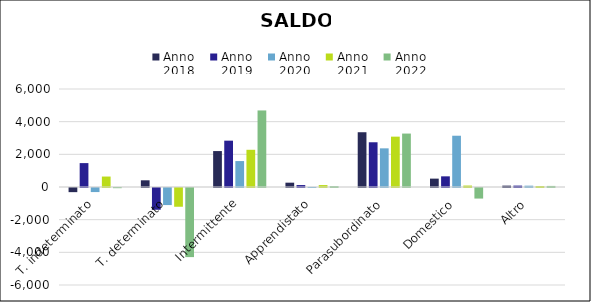
| Category | Anno
2018 | Anno
2019 | Anno
2020 | Anno
2021 | Anno
2022 |
|---|---|---|---|---|---|
| T. indeterminato | -254 | 1463 | -249 | 640 | -11 |
| T. determinato | 410 | -1333 | -1045 | -1148 | -4231 |
| Intermittente | 2200 | 2837 | 1588 | 2278 | 4687 |
| Apprendistato | 265 | 119 | 4 | 118 | 56 |
| Parasubordinato | 3353 | 2739 | 2367 | 3083 | 3272 |
| Domestico | 513 | 653 | 3139 | 89 | -647 |
| Altro | 84 | 85 | 81 | 58 | 66 |